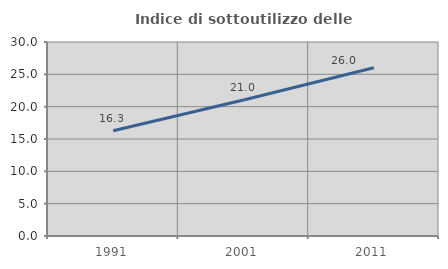
| Category | Indice di sottoutilizzo delle abitazioni  |
|---|---|
| 1991.0 | 16.279 |
| 2001.0 | 21.028 |
| 2011.0 | 26.027 |